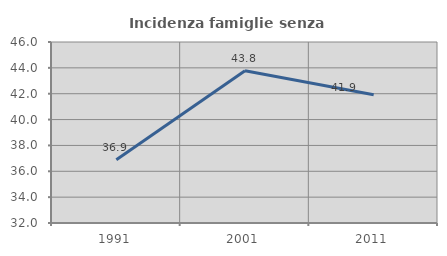
| Category | Incidenza famiglie senza nuclei |
|---|---|
| 1991.0 | 36.898 |
| 2001.0 | 43.779 |
| 2011.0 | 41.921 |